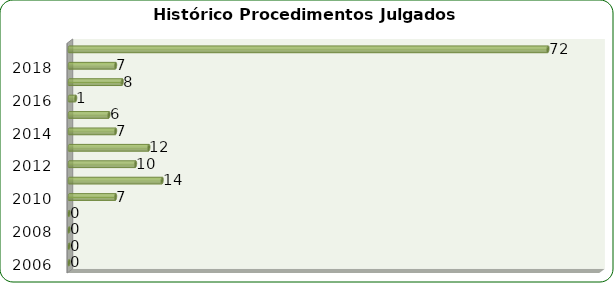
| Category | Total de Sindicâncias  |
|---|---|
| 2006 | 0 |
| 2007 | 0 |
| 2008 | 0 |
| 2009 | 0 |
| 2010 | 7 |
| 2011 | 14 |
| 2012 | 10 |
| 2013 | 12 |
| 2014 | 7 |
| 2015 | 6 |
| 2016 | 1 |
| 2017 | 8 |
| 2018 | 7 |
| Total | 72 |